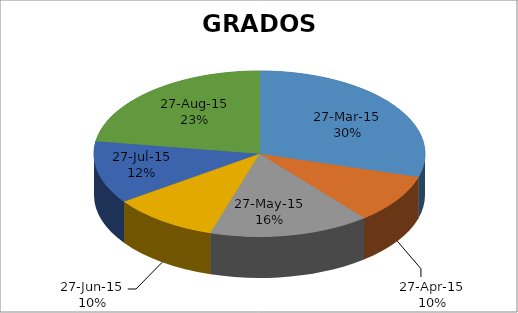
| Category | Series 0 |
|---|---|
| 42090.0 | 34 |
| 42152.0 | 11 |
| 42216.0 | 18 |
| 42272.0 | 12 |
| 42328.0 | 14 |
| 42354.0 | 26 |